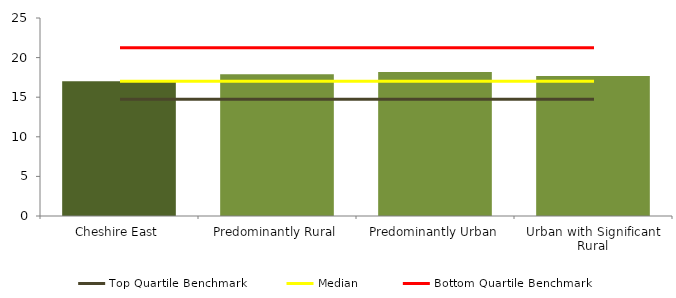
| Category | Series 0 |
|---|---|
| Cheshire East | 17 |
| Predominantly Rural | 17.909 |
| Predominantly Urban | 18.194 |
| Urban with Significant Rural | 17.667 |